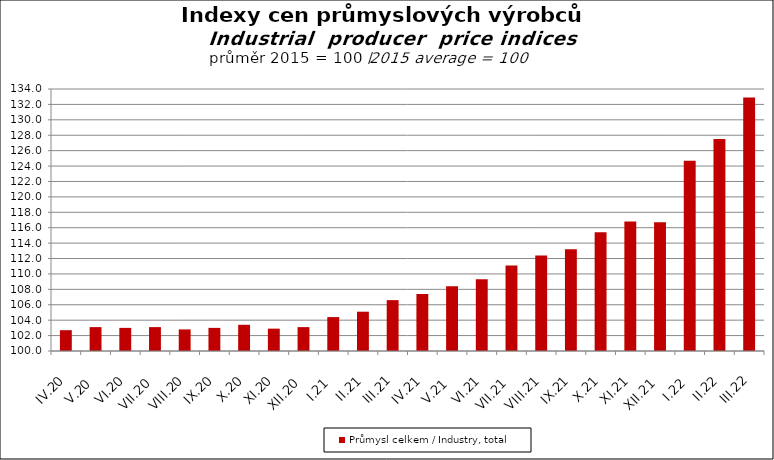
| Category | Průmysl celkem / Industry, total |
|---|---|
| IV.20 | 102.7 |
| V.20 | 103.1 |
| VI.20 | 103 |
| VII.20 | 103.1 |
| VIII.20 | 102.8 |
| IX.20 | 103 |
| X.20 | 103.4 |
| XI.20 | 102.9 |
| XII.20 | 103.1 |
| I.21 | 104.4 |
| II.21 | 105.1 |
| III.21 | 106.6 |
| IV.21 | 107.4 |
| V.21 | 108.4 |
| VI.21 | 109.3 |
| VII.21 | 111.1 |
| VIII.21 | 112.4 |
| IX.21 | 113.2 |
| X.21 | 115.4 |
| XI.21 | 116.8 |
| XII.21 | 116.7 |
| I.22 | 124.7 |
| II.22 | 127.5 |
| III.22 | 132.9 |